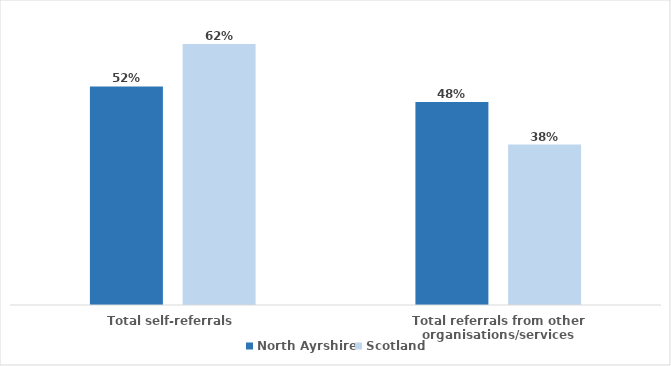
| Category | North Ayrshire | Scotland |
|---|---|---|
| Total self-referrals | 0.519 | 0.619 |
| Total referrals from other organisations/services | 0.481 | 0.381 |